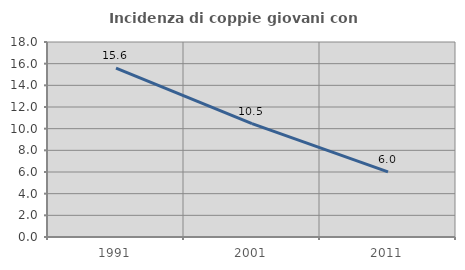
| Category | Incidenza di coppie giovani con figli |
|---|---|
| 1991.0 | 15.587 |
| 2001.0 | 10.468 |
| 2011.0 | 6.017 |